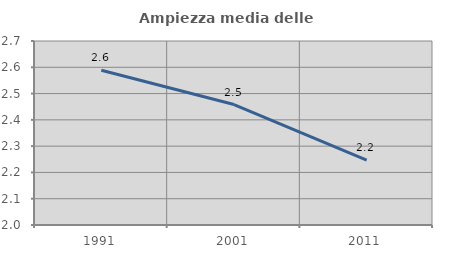
| Category | Ampiezza media delle famiglie |
|---|---|
| 1991.0 | 2.589 |
| 2001.0 | 2.458 |
| 2011.0 | 2.247 |